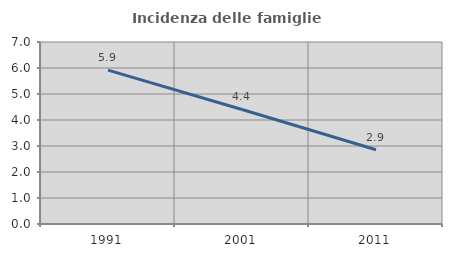
| Category | Incidenza delle famiglie numerose |
|---|---|
| 1991.0 | 5.92 |
| 2001.0 | 4.406 |
| 2011.0 | 2.857 |